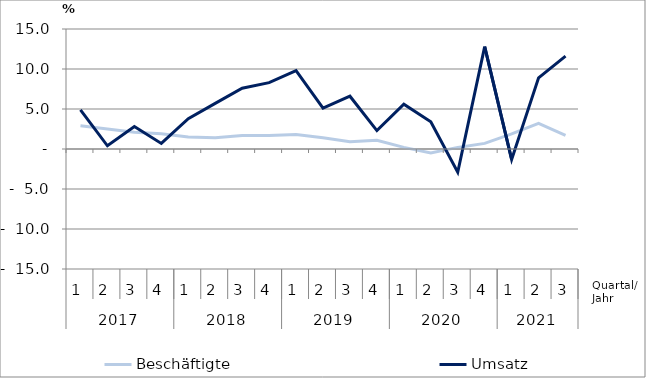
| Category | Beschäftigte | Umsatz |
|---|---|---|
| 0 | 2.9 | 4.9 |
| 1 | 2.5 | 0.4 |
| 2 | 2.1 | 2.8 |
| 3 | 1.9 | 0.7 |
| 4 | 1.5 | 3.8 |
| 5 | 1.4 | 5.7 |
| 6 | 1.7 | 7.6 |
| 7 | 1.7 | 8.3 |
| 8 | 1.8 | 9.8 |
| 9 | 1.4 | 5.1 |
| 10 | 0.9 | 6.6 |
| 11 | 1.1 | 2.3 |
| 12 | 0.2 | 5.6 |
| 13 | -0.5 | 3.4 |
| 14 | 0.2 | -2.9 |
| 15 | 0.7 | 12.8 |
| 16 | 1.9 | -1.3 |
| 17 | 3.2 | 8.9 |
| 18 | 1.7 | 11.6 |